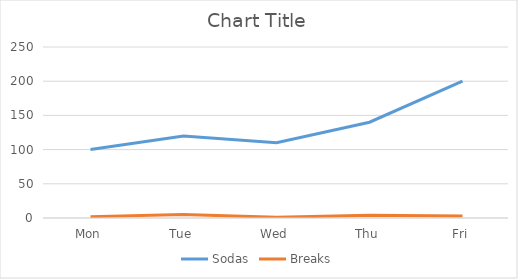
| Category | Sodas | Breaks |
|---|---|---|
| Mon | 100 | 2 |
| Tue | 120 | 5 |
| Wed | 110 | 1 |
| Thu | 140 | 4 |
| Fri | 200 | 3 |